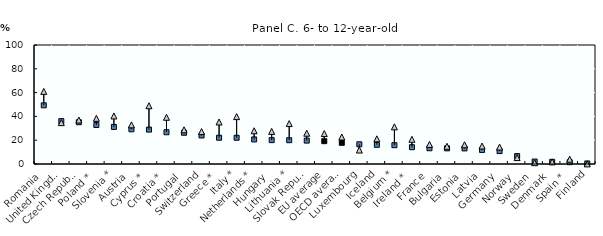
| Category | Not attained tertiary education | Attained tertiary education |
|---|---|---|
| Romania | 49.315 | 61.012 |
| United Kingdom | 36.027 | 34.773 |
| Czech Republic | 35.112 | 36.985 |
| Poland * | 32.786 | 38.399 |
| Slovenia * | 31.17 | 40.378 |
| Austria | 29.171 | 32.895 |
| Cyprus * | 28.925 | 48.96 |
| Croatia * | 26.684 | 39.25 |
| Portugal | 26.258 | 28.733 |
| Switzerland | 23.97 | 27.225 |
| Greece * | 22.083 | 35.32 |
| Italy * | 22.054 | 39.812 |
| Netherlands * | 20.645 | 27.941 |
| Hungary | 20.062 | 27.428 |
| Lithuania * | 20.005 | 33.969 |
| Slovak Republic | 19.665 | 25.876 |
| EU average | 19.171 | 25.558 |
| OECD average | 17.815 | 22.651 |
| Luxembourg | 16.55 | 11.727 |
| Iceland | 16.136 | 21.148 |
| Belgium * | 15.813 | 31.232 |
| Ireland * | 14.11 | 20.76 |
| France | 13.242 | 16.431 |
| Bulgaria | 13.151 | 14.893 |
| Estonia | 13.112 | 16.144 |
| Latvia | 11.805 | 15.086 |
| Germany | 10.845 | 14.228 |
| Norway | 6.676 | 5.395 |
| Sweden | 2.056 | 1.127 |
| Denmark | 1.822 | 1.8 |
| Spain * | 1.534 | 4.013 |
| Finland | 0.466 | 0.102 |